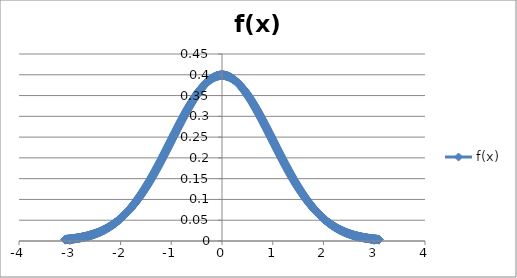
| Category | f(x) |
|---|---|
| -3.090232306167813 | 0.003 |
| -3.0840518415554774 | 0.003 |
| -3.0778713769431416 | 0.003 |
| -3.071690912330806 | 0.004 |
| -3.06551044771847 | 0.004 |
| -3.0593299831061342 | 0.004 |
| -3.0531495184937985 | 0.004 |
| -3.0469690538814627 | 0.004 |
| -3.040788589269127 | 0.004 |
| -3.034608124656791 | 0.004 |
| -3.0284276600444553 | 0.004 |
| -3.0222471954321195 | 0.004 |
| -3.0160667308197837 | 0.004 |
| -3.009886266207448 | 0.004 |
| -3.003705801595112 | 0.004 |
| -2.9975253369827763 | 0.004 |
| -2.9913448723704406 | 0.005 |
| -2.9851644077581048 | 0.005 |
| -2.978983943145769 | 0.005 |
| -2.972803478533433 | 0.005 |
| -2.9666230139210974 | 0.005 |
| -2.9604425493087616 | 0.005 |
| -2.954262084696426 | 0.005 |
| -2.94808162008409 | 0.005 |
| -2.9419011554717542 | 0.005 |
| -2.9357206908594184 | 0.005 |
| -2.9295402262470827 | 0.005 |
| -2.923359761634747 | 0.006 |
| -2.917179297022411 | 0.006 |
| -2.9109988324100753 | 0.006 |
| -2.9048183677977395 | 0.006 |
| -2.8986379031854037 | 0.006 |
| -2.892457438573068 | 0.006 |
| -2.886276973960732 | 0.006 |
| -2.8800965093483963 | 0.006 |
| -2.8739160447360605 | 0.006 |
| -2.8677355801237248 | 0.007 |
| -2.861555115511389 | 0.007 |
| -2.855374650899053 | 0.007 |
| -2.8491941862867174 | 0.007 |
| -2.8430137216743816 | 0.007 |
| -2.836833257062046 | 0.007 |
| -2.83065279244971 | 0.007 |
| -2.8244723278373742 | 0.007 |
| -2.8182918632250384 | 0.008 |
| -2.8121113986127027 | 0.008 |
| -2.805930934000367 | 0.008 |
| -2.799750469388031 | 0.008 |
| -2.7935700047756953 | 0.008 |
| -2.7873895401633595 | 0.008 |
| -2.7812090755510237 | 0.008 |
| -2.775028610938688 | 0.008 |
| -2.768848146326352 | 0.009 |
| -2.7626676817140163 | 0.009 |
| -2.7564872171016805 | 0.009 |
| -2.7503067524893448 | 0.009 |
| -2.744126287877009 | 0.009 |
| -2.737945823264673 | 0.009 |
| -2.7317653586523374 | 0.01 |
| -2.7255848940400016 | 0.01 |
| -2.719404429427666 | 0.01 |
| -2.71322396481533 | 0.01 |
| -2.7070435002029942 | 0.01 |
| -2.7008630355906584 | 0.01 |
| -2.6946825709783226 | 0.011 |
| -2.688502106365987 | 0.011 |
| -2.682321641753651 | 0.011 |
| -2.6761411771413153 | 0.011 |
| -2.6699607125289795 | 0.011 |
| -2.6637802479166437 | 0.011 |
| -2.657599783304308 | 0.012 |
| -2.651419318691972 | 0.012 |
| -2.6452388540796363 | 0.012 |
| -2.6390583894673005 | 0.012 |
| -2.6328779248549647 | 0.012 |
| -2.626697460242629 | 0.013 |
| -2.620516995630293 | 0.013 |
| -2.6143365310179574 | 0.013 |
| -2.6081560664056216 | 0.013 |
| -2.601975601793286 | 0.014 |
| -2.59579513718095 | 0.014 |
| -2.589614672568614 | 0.014 |
| -2.5834342079562784 | 0.014 |
| -2.5772537433439426 | 0.014 |
| -2.571073278731607 | 0.015 |
| -2.564892814119271 | 0.015 |
| -2.5587123495069353 | 0.015 |
| -2.5525318848945995 | 0.015 |
| -2.5463514202822637 | 0.016 |
| -2.540170955669928 | 0.016 |
| -2.533990491057592 | 0.016 |
| -2.5278100264452563 | 0.016 |
| -2.5216295618329205 | 0.017 |
| -2.5154490972205847 | 0.017 |
| -2.509268632608249 | 0.017 |
| -2.503088167995913 | 0.017 |
| -2.4969077033835774 | 0.018 |
| -2.4907272387712416 | 0.018 |
| -2.484546774158906 | 0.018 |
| -2.47836630954657 | 0.018 |
| -2.472185844934234 | 0.019 |
| -2.4660053803218984 | 0.019 |
| -2.4598249157095626 | 0.019 |
| -2.453644451097227 | 0.02 |
| -2.447463986484891 | 0.02 |
| -2.4412835218725553 | 0.02 |
| -2.4351030572602195 | 0.021 |
| -2.4289225926478837 | 0.021 |
| -2.422742128035548 | 0.021 |
| -2.416561663423212 | 0.022 |
| -2.4103811988108763 | 0.022 |
| -2.4042007341985405 | 0.022 |
| -2.3980202695862047 | 0.023 |
| -2.391839804973869 | 0.023 |
| -2.385659340361533 | 0.023 |
| -2.3794788757491974 | 0.024 |
| -2.3732984111368616 | 0.024 |
| -2.367117946524526 | 0.024 |
| -2.36093748191219 | 0.025 |
| -2.354757017299854 | 0.025 |
| -2.3485765526875184 | 0.025 |
| -2.3423960880751826 | 0.026 |
| -2.336215623462847 | 0.026 |
| -2.330035158850511 | 0.026 |
| -2.3238546942381753 | 0.027 |
| -2.3176742296258395 | 0.027 |
| -2.3114937650135037 | 0.028 |
| -2.305313300401168 | 0.028 |
| -2.299132835788832 | 0.028 |
| -2.2929523711764963 | 0.029 |
| -2.2867719065641605 | 0.029 |
| -2.2805914419518247 | 0.03 |
| -2.274410977339489 | 0.03 |
| -2.268230512727153 | 0.03 |
| -2.2620500481148174 | 0.031 |
| -2.2558695835024816 | 0.031 |
| -2.249689118890146 | 0.032 |
| -2.24350865427781 | 0.032 |
| -2.237328189665474 | 0.033 |
| -2.2311477250531384 | 0.033 |
| -2.2249672604408026 | 0.034 |
| -2.218786795828467 | 0.034 |
| -2.212606331216131 | 0.035 |
| -2.2064258666037952 | 0.035 |
| -2.2002454019914595 | 0.035 |
| -2.1940649373791237 | 0.036 |
| -2.187884472766788 | 0.036 |
| -2.181704008154452 | 0.037 |
| -2.1755235435421163 | 0.037 |
| -2.1693430789297805 | 0.038 |
| -2.1631626143174447 | 0.038 |
| -2.156982149705109 | 0.039 |
| -2.150801685092773 | 0.039 |
| -2.1446212204804374 | 0.04 |
| -2.1384407558681016 | 0.041 |
| -2.1322602912557658 | 0.041 |
| -2.12607982664343 | 0.042 |
| -2.119899362031094 | 0.042 |
| -2.1137188974187584 | 0.043 |
| -2.1075384328064226 | 0.043 |
| -2.101357968194087 | 0.044 |
| -2.095177503581751 | 0.044 |
| -2.0889970389694152 | 0.045 |
| -2.0828165743570795 | 0.046 |
| -2.0766361097447437 | 0.046 |
| -2.070455645132408 | 0.047 |
| -2.064275180520072 | 0.047 |
| -2.0580947159077363 | 0.048 |
| -2.0519142512954005 | 0.049 |
| -2.0457337866830647 | 0.049 |
| -2.039553322070729 | 0.05 |
| -2.033372857458393 | 0.05 |
| -2.0271923928460573 | 0.051 |
| -2.0210119282337216 | 0.052 |
| -2.0148314636213858 | 0.052 |
| -2.00865099900905 | 0.053 |
| -2.002470534396714 | 0.054 |
| -1.9962900697843786 | 0.054 |
| -1.990109605172043 | 0.055 |
| -1.9839291405597075 | 0.056 |
| -1.977748675947372 | 0.056 |
| -1.9715682113350363 | 0.057 |
| -1.9653877467227008 | 0.058 |
| -1.9592072821103652 | 0.059 |
| -1.9530268174980296 | 0.059 |
| -1.946846352885694 | 0.06 |
| -1.9406658882733585 | 0.061 |
| -1.934485423661023 | 0.061 |
| -1.9283049590486874 | 0.062 |
| -1.9221244944363518 | 0.063 |
| -1.9159440298240162 | 0.064 |
| -1.9097635652116807 | 0.064 |
| -1.903583100599345 | 0.065 |
| -1.8974026359870095 | 0.066 |
| -1.891222171374674 | 0.067 |
| -1.8850417067623384 | 0.067 |
| -1.8788612421500028 | 0.068 |
| -1.8726807775376673 | 0.069 |
| -1.8665003129253317 | 0.07 |
| -1.8603198483129961 | 0.071 |
| -1.8541393837006606 | 0.072 |
| -1.847958919088325 | 0.072 |
| -1.8417784544759894 | 0.073 |
| -1.8355979898636539 | 0.074 |
| -1.8294175252513183 | 0.075 |
| -1.8232370606389827 | 0.076 |
| -1.8170565960266472 | 0.077 |
| -1.8108761314143116 | 0.077 |
| -1.804695666801976 | 0.078 |
| -1.7985152021896404 | 0.079 |
| -1.7923347375773049 | 0.08 |
| -1.7861542729649693 | 0.081 |
| -1.7799738083526337 | 0.082 |
| -1.7737933437402982 | 0.083 |
| -1.7676128791279626 | 0.084 |
| -1.761432414515627 | 0.085 |
| -1.7552519499032915 | 0.085 |
| -1.749071485290956 | 0.086 |
| -1.7428910206786203 | 0.087 |
| -1.7367105560662848 | 0.088 |
| -1.7305300914539492 | 0.089 |
| -1.7243496268416136 | 0.09 |
| -1.718169162229278 | 0.091 |
| -1.7119886976169425 | 0.092 |
| -1.705808233004607 | 0.093 |
| -1.6996277683922714 | 0.094 |
| -1.6934473037799358 | 0.095 |
| -1.6872668391676002 | 0.096 |
| -1.6810863745552647 | 0.097 |
| -1.674905909942929 | 0.098 |
| -1.6687254453305935 | 0.099 |
| -1.662544980718258 | 0.1 |
| -1.6563645161059224 | 0.101 |
| -1.6501840514935868 | 0.102 |
| -1.6440035868812513 | 0.103 |
| -1.6378231222689157 | 0.104 |
| -1.6316426576565801 | 0.105 |
| -1.6254621930442446 | 0.106 |
| -1.619281728431909 | 0.108 |
| -1.6131012638195734 | 0.109 |
| -1.6069207992072378 | 0.11 |
| -1.6007403345949023 | 0.111 |
| -1.5945598699825667 | 0.112 |
| -1.5883794053702311 | 0.113 |
| -1.5821989407578956 | 0.114 |
| -1.57601847614556 | 0.115 |
| -1.5698380115332244 | 0.116 |
| -1.5636575469208889 | 0.117 |
| -1.5574770823085533 | 0.119 |
| -1.5512966176962177 | 0.12 |
| -1.5451161530838822 | 0.121 |
| -1.5389356884715466 | 0.122 |
| -1.532755223859211 | 0.123 |
| -1.5265747592468755 | 0.124 |
| -1.52039429463454 | 0.126 |
| -1.5142138300222043 | 0.127 |
| -1.5080333654098688 | 0.128 |
| -1.5018529007975332 | 0.129 |
| -1.4956724361851976 | 0.13 |
| -1.489491971572862 | 0.132 |
| -1.4833115069605265 | 0.133 |
| -1.477131042348191 | 0.134 |
| -1.4709505777358554 | 0.135 |
| -1.4647701131235198 | 0.136 |
| -1.4585896485111842 | 0.138 |
| -1.4524091838988487 | 0.139 |
| -1.446228719286513 | 0.14 |
| -1.4400482546741775 | 0.141 |
| -1.433867790061842 | 0.143 |
| -1.4276873254495064 | 0.144 |
| -1.4215068608371708 | 0.145 |
| -1.4153263962248352 | 0.147 |
| -1.4091459316124997 | 0.148 |
| -1.4029654670001641 | 0.149 |
| -1.3967850023878285 | 0.15 |
| -1.390604537775493 | 0.152 |
| -1.3844240731631574 | 0.153 |
| -1.3782436085508218 | 0.154 |
| -1.3720631439384863 | 0.156 |
| -1.3658826793261507 | 0.157 |
| -1.3597022147138151 | 0.158 |
| -1.3535217501014796 | 0.16 |
| -1.347341285489144 | 0.161 |
| -1.3411608208768084 | 0.162 |
| -1.3349803562644729 | 0.164 |
| -1.3287998916521373 | 0.165 |
| -1.3226194270398017 | 0.166 |
| -1.3164389624274662 | 0.168 |
| -1.3102584978151306 | 0.169 |
| -1.304078033202795 | 0.17 |
| -1.2978975685904595 | 0.172 |
| -1.291717103978124 | 0.173 |
| -1.2855366393657883 | 0.175 |
| -1.2793561747534528 | 0.176 |
| -1.2731757101411172 | 0.177 |
| -1.2669952455287816 | 0.179 |
| -1.260814780916446 | 0.18 |
| -1.2546343163041105 | 0.182 |
| -1.248453851691775 | 0.183 |
| -1.2422733870794394 | 0.184 |
| -1.2360929224671038 | 0.186 |
| -1.2299124578547682 | 0.187 |
| -1.2237319932424326 | 0.189 |
| -1.217551528630097 | 0.19 |
| -1.2113710640177615 | 0.192 |
| -1.205190599405426 | 0.193 |
| -1.1990101347930904 | 0.194 |
| -1.1928296701807548 | 0.196 |
| -1.1866492055684192 | 0.197 |
| -1.1804687409560837 | 0.199 |
| -1.174288276343748 | 0.2 |
| -1.1681078117314125 | 0.202 |
| -1.161927347119077 | 0.203 |
| -1.1557468825067414 | 0.205 |
| -1.1495664178944058 | 0.206 |
| -1.1433859532820703 | 0.208 |
| -1.1372054886697347 | 0.209 |
| -1.1310250240573991 | 0.21 |
| -1.1248445594450636 | 0.212 |
| -1.118664094832728 | 0.213 |
| -1.1124836302203924 | 0.215 |
| -1.1063031656080569 | 0.216 |
| -1.1001227009957213 | 0.218 |
| -1.0939422363833857 | 0.219 |
| -1.0877617717710502 | 0.221 |
| -1.0815813071587146 | 0.222 |
| -1.075400842546379 | 0.224 |
| -1.0692203779340435 | 0.225 |
| -1.0630399133217079 | 0.227 |
| -1.0568594487093723 | 0.228 |
| -1.0506789840970368 | 0.23 |
| -1.0444985194847012 | 0.231 |
| -1.0383180548723656 | 0.233 |
| -1.03213759026003 | 0.234 |
| -1.0259571256476945 | 0.236 |
| -1.019776661035359 | 0.237 |
| -1.0135961964230233 | 0.239 |
| -1.0074157318106878 | 0.24 |
| -1.0012352671983522 | 0.242 |
| -0.9950548025860165 | 0.243 |
| -0.9888743379736809 | 0.245 |
| -0.9826938733613452 | 0.246 |
| -0.9765134087490095 | 0.248 |
| -0.9703329441366738 | 0.249 |
| -0.9641524795243381 | 0.251 |
| -0.9579720149120025 | 0.252 |
| -0.9517915502996668 | 0.254 |
| -0.9456110856873311 | 0.255 |
| -0.9394306210749954 | 0.257 |
| -0.9332501564626597 | 0.258 |
| -0.9270696918503241 | 0.26 |
| -0.9208892272379884 | 0.261 |
| -0.9147087626256527 | 0.263 |
| -0.908528298013317 | 0.264 |
| -0.9023478334009813 | 0.266 |
| -0.8961673687886457 | 0.267 |
| -0.88998690417631 | 0.268 |
| -0.8838064395639743 | 0.27 |
| -0.8776259749516386 | 0.271 |
| -0.871445510339303 | 0.273 |
| -0.8652650457269673 | 0.274 |
| -0.8590845811146316 | 0.276 |
| -0.8529041165022959 | 0.277 |
| -0.8467236518899602 | 0.279 |
| -0.8405431872776246 | 0.28 |
| -0.8343627226652889 | 0.282 |
| -0.8281822580529532 | 0.283 |
| -0.8220017934406175 | 0.285 |
| -0.8158213288282818 | 0.286 |
| -0.8096408642159462 | 0.287 |
| -0.8034603996036105 | 0.289 |
| -0.7972799349912748 | 0.29 |
| -0.7910994703789391 | 0.292 |
| -0.7849190057666035 | 0.293 |
| -0.7787385411542678 | 0.295 |
| -0.7725580765419321 | 0.296 |
| -0.7663776119295964 | 0.297 |
| -0.7601971473172607 | 0.299 |
| -0.7540166827049251 | 0.3 |
| -0.7478362180925894 | 0.302 |
| -0.7416557534802537 | 0.303 |
| -0.735475288867918 | 0.304 |
| -0.7292948242555823 | 0.306 |
| -0.7231143596432467 | 0.307 |
| -0.716933895030911 | 0.309 |
| -0.7107534304185753 | 0.31 |
| -0.7045729658062396 | 0.311 |
| -0.698392501193904 | 0.313 |
| -0.6922120365815683 | 0.314 |
| -0.6860315719692326 | 0.315 |
| -0.6798511073568969 | 0.317 |
| -0.6736706427445612 | 0.318 |
| -0.6674901781322256 | 0.319 |
| -0.6613097135198899 | 0.321 |
| -0.6551292489075542 | 0.322 |
| -0.6489487842952185 | 0.323 |
| -0.6427683196828828 | 0.324 |
| -0.6365878550705472 | 0.326 |
| -0.6304073904582115 | 0.327 |
| -0.6242269258458758 | 0.328 |
| -0.6180464612335401 | 0.33 |
| -0.6118659966212044 | 0.331 |
| -0.6056855320088688 | 0.332 |
| -0.5995050673965331 | 0.333 |
| -0.5933246027841974 | 0.335 |
| -0.5871441381718617 | 0.336 |
| -0.580963673559526 | 0.337 |
| -0.5747832089471904 | 0.338 |
| -0.5686027443348547 | 0.339 |
| -0.562422279722519 | 0.341 |
| -0.5562418151101833 | 0.342 |
| -0.5500613504978477 | 0.343 |
| -0.543880885885512 | 0.344 |
| -0.5377004212731763 | 0.345 |
| -0.5315199566608406 | 0.346 |
| -0.5253394920485049 | 0.348 |
| -0.5191590274361693 | 0.349 |
| -0.5129785628238336 | 0.35 |
| -0.5067980982114979 | 0.351 |
| -0.5006176335991622 | 0.352 |
| -0.4944371689868266 | 0.353 |
| -0.488256704374491 | 0.354 |
| -0.48207623976215536 | 0.355 |
| -0.47589577514981973 | 0.356 |
| -0.4697153105374841 | 0.357 |
| -0.4635348459251485 | 0.358 |
| -0.45735438131281286 | 0.359 |
| -0.45117391670047724 | 0.36 |
| -0.4449934520881416 | 0.361 |
| -0.438812987475806 | 0.362 |
| -0.43263252286347037 | 0.363 |
| -0.42645205825113475 | 0.364 |
| -0.4202715936387991 | 0.365 |
| -0.4140911290264635 | 0.366 |
| -0.4079106644141279 | 0.367 |
| -0.40173019980179225 | 0.368 |
| -0.39554973518945663 | 0.369 |
| -0.389369270577121 | 0.37 |
| -0.3831888059647854 | 0.371 |
| -0.37700834135244976 | 0.372 |
| -0.37082787674011414 | 0.372 |
| -0.3646474121277785 | 0.373 |
| -0.3584669475154429 | 0.374 |
| -0.35228648290310727 | 0.375 |
| -0.34610601829077164 | 0.376 |
| -0.339925553678436 | 0.377 |
| -0.3337450890661004 | 0.377 |
| -0.3275646244537648 | 0.378 |
| -0.32138415984142915 | 0.379 |
| -0.31520369522909353 | 0.38 |
| -0.3090232306167579 | 0.38 |
| -0.3028427660044223 | 0.381 |
| -0.29666230139208666 | 0.382 |
| -0.29048183677975103 | 0.382 |
| -0.2843013721674154 | 0.383 |
| -0.2781209075550798 | 0.384 |
| -0.27194044294274416 | 0.384 |
| -0.26575997833040854 | 0.385 |
| -0.2595795137180729 | 0.386 |
| -0.2533990491057373 | 0.386 |
| -0.24721858449340167 | 0.387 |
| -0.24103811988106605 | 0.388 |
| -0.23485765526873043 | 0.388 |
| -0.2286771906563948 | 0.389 |
| -0.22249672604405918 | 0.389 |
| -0.21631626143172356 | 0.39 |
| -0.21013579681938793 | 0.39 |
| -0.2039553322070523 | 0.391 |
| -0.19777486759471669 | 0.391 |
| -0.19159440298238106 | 0.392 |
| -0.18541393837004544 | 0.392 |
| -0.17923347375770982 | 0.393 |
| -0.1730530091453742 | 0.393 |
| -0.16687254453303857 | 0.393 |
| -0.16069207992070295 | 0.394 |
| -0.15451161530836732 | 0.394 |
| -0.1483311506960317 | 0.395 |
| -0.14215068608369608 | 0.395 |
| -0.13597022147136045 | 0.395 |
| -0.12978975685902483 | 0.396 |
| -0.1236092922466892 | 0.396 |
| -0.11742882763435358 | 0.396 |
| -0.11124836302201796 | 0.396 |
| -0.10506789840968234 | 0.397 |
| -0.09888743379734671 | 0.397 |
| -0.09270696918501109 | 0.397 |
| -0.08652650457267547 | 0.397 |
| -0.08034603996033984 | 0.398 |
| -0.07416557534800422 | 0.398 |
| -0.0679851107356686 | 0.398 |
| -0.061804646123332974 | 0.398 |
| -0.05562418151099735 | 0.398 |
| -0.04944371689866173 | 0.398 |
| -0.043263252286326104 | 0.399 |
| -0.03708278767399048 | 0.399 |
| -0.030902323061654854 | 0.399 |
| -0.024721858449319227 | 0.399 |
| -0.0185413938369836 | 0.399 |
| -0.012360929224647974 | 0.399 |
| -0.006180464612312347 | 0.399 |
| 2.327998904760875e-14 | 0.399 |
| 0.006180464612358907 | 0.399 |
| 0.012360929224694533 | 0.399 |
| 0.01854139383703016 | 0.399 |
| 0.024721858449365787 | 0.399 |
| 0.030902323061701414 | 0.399 |
| 0.03708278767403704 | 0.399 |
| 0.043263252286372664 | 0.399 |
| 0.04944371689870829 | 0.398 |
| 0.05562418151104391 | 0.398 |
| 0.061804646123379534 | 0.398 |
| 0.06798511073571516 | 0.398 |
| 0.07416557534805078 | 0.398 |
| 0.0803460399603864 | 0.398 |
| 0.08652650457272203 | 0.397 |
| 0.09270696918505765 | 0.397 |
| 0.09888743379739327 | 0.397 |
| 0.1050678984097289 | 0.397 |
| 0.11124836302206452 | 0.396 |
| 0.11742882763440014 | 0.396 |
| 0.12360929224673577 | 0.396 |
| 0.1297897568590714 | 0.396 |
| 0.13597022147140703 | 0.395 |
| 0.14215068608374265 | 0.395 |
| 0.14833115069607827 | 0.395 |
| 0.1545116153084139 | 0.394 |
| 0.16069207992074952 | 0.394 |
| 0.16687254453308514 | 0.393 |
| 0.17305300914542077 | 0.393 |
| 0.1792334737577564 | 0.393 |
| 0.185413938370092 | 0.392 |
| 0.19159440298242764 | 0.392 |
| 0.19777486759476326 | 0.391 |
| 0.20395533220709888 | 0.391 |
| 0.2101357968194345 | 0.39 |
| 0.21631626143177013 | 0.39 |
| 0.22249672604410575 | 0.389 |
| 0.22867719065644138 | 0.389 |
| 0.234857655268777 | 0.388 |
| 0.24103811988111262 | 0.388 |
| 0.24721858449344825 | 0.387 |
| 0.25339904910578387 | 0.386 |
| 0.2595795137181195 | 0.386 |
| 0.2657599783304551 | 0.385 |
| 0.27194044294279074 | 0.384 |
| 0.27812090755512636 | 0.384 |
| 0.284301372167462 | 0.383 |
| 0.2904818367797976 | 0.382 |
| 0.29666230139213323 | 0.382 |
| 0.30284276600446886 | 0.381 |
| 0.3090232306168045 | 0.38 |
| 0.3152036952291401 | 0.38 |
| 0.3213841598414757 | 0.379 |
| 0.32756462445381135 | 0.378 |
| 0.33374508906614697 | 0.377 |
| 0.3399255536784826 | 0.377 |
| 0.3461060182908182 | 0.376 |
| 0.35228648290315384 | 0.375 |
| 0.35846694751548946 | 0.374 |
| 0.3646474121278251 | 0.373 |
| 0.3708278767401607 | 0.372 |
| 0.37700834135249633 | 0.372 |
| 0.38318880596483196 | 0.371 |
| 0.3893692705771676 | 0.37 |
| 0.3955497351895032 | 0.369 |
| 0.4017301998018388 | 0.368 |
| 0.40791066441417445 | 0.367 |
| 0.4140911290265101 | 0.366 |
| 0.4202715936388457 | 0.365 |
| 0.4264520582511813 | 0.364 |
| 0.43263252286351694 | 0.363 |
| 0.43881298747585257 | 0.362 |
| 0.4449934520881882 | 0.361 |
| 0.4511739167005238 | 0.36 |
| 0.45735438131285944 | 0.359 |
| 0.46353484592519506 | 0.358 |
| 0.4697153105375307 | 0.357 |
| 0.4758957751498663 | 0.356 |
| 0.48207623976220193 | 0.355 |
| 0.48825670437453755 | 0.354 |
| 0.4944371689868732 | 0.353 |
| 0.5006176335992089 | 0.352 |
| 0.5067980982115445 | 0.351 |
| 0.5129785628238802 | 0.35 |
| 0.5191590274362159 | 0.349 |
| 0.5253394920485516 | 0.348 |
| 0.5315199566608872 | 0.346 |
| 0.5377004212732229 | 0.345 |
| 0.5438808858855586 | 0.344 |
| 0.5500613504978943 | 0.343 |
| 0.55624181511023 | 0.342 |
| 0.5624222797225656 | 0.341 |
| 0.5686027443349013 | 0.339 |
| 0.574783208947237 | 0.338 |
| 0.5809636735595727 | 0.337 |
| 0.5871441381719084 | 0.336 |
| 0.593324602784244 | 0.335 |
| 0.5995050673965797 | 0.333 |
| 0.6056855320089154 | 0.332 |
| 0.6118659966212511 | 0.331 |
| 0.6180464612335868 | 0.33 |
| 0.6242269258459224 | 0.328 |
| 0.6304073904582581 | 0.327 |
| 0.6365878550705938 | 0.326 |
| 0.6427683196829295 | 0.324 |
| 0.6489487842952651 | 0.323 |
| 0.6551292489076008 | 0.322 |
| 0.6613097135199365 | 0.321 |
| 0.6674901781322722 | 0.319 |
| 0.6736706427446079 | 0.318 |
| 0.6798511073569435 | 0.317 |
| 0.6860315719692792 | 0.315 |
| 0.6922120365816149 | 0.314 |
| 0.6983925011939506 | 0.313 |
| 0.7045729658062863 | 0.311 |
| 0.7107534304186219 | 0.31 |
| 0.7169338950309576 | 0.309 |
| 0.7231143596432933 | 0.307 |
| 0.729294824255629 | 0.306 |
| 0.7354752888679646 | 0.304 |
| 0.7416557534803003 | 0.303 |
| 0.747836218092636 | 0.302 |
| 0.7540166827049717 | 0.3 |
| 0.7601971473173074 | 0.299 |
| 0.766377611929643 | 0.297 |
| 0.7725580765419787 | 0.296 |
| 0.7787385411543144 | 0.295 |
| 0.7849190057666501 | 0.293 |
| 0.7910994703789858 | 0.292 |
| 0.7972799349913214 | 0.29 |
| 0.8034603996036571 | 0.289 |
| 0.8096408642159928 | 0.287 |
| 0.8158213288283285 | 0.286 |
| 0.8220017934406642 | 0.285 |
| 0.8281822580529998 | 0.283 |
| 0.8343627226653355 | 0.282 |
| 0.8405431872776712 | 0.28 |
| 0.8467236518900069 | 0.279 |
| 0.8529041165023425 | 0.277 |
| 0.8590845811146782 | 0.276 |
| 0.8652650457270139 | 0.274 |
| 0.8714455103393496 | 0.273 |
| 0.8776259749516853 | 0.271 |
| 0.8838064395640209 | 0.27 |
| 0.8899869041763566 | 0.268 |
| 0.8961673687886923 | 0.267 |
| 0.902347833401028 | 0.266 |
| 0.9085282980133637 | 0.264 |
| 0.9147087626256993 | 0.263 |
| 0.920889227238035 | 0.261 |
| 0.9270696918503707 | 0.26 |
| 0.9332501564627064 | 0.258 |
| 0.939430621075042 | 0.257 |
| 0.9456110856873777 | 0.255 |
| 0.9517915502997134 | 0.254 |
| 0.9579720149120491 | 0.252 |
| 0.9641524795243848 | 0.251 |
| 0.9703329441367204 | 0.249 |
| 0.9765134087490561 | 0.248 |
| 0.9826938733613918 | 0.246 |
| 0.9888743379737275 | 0.245 |
| 0.9950548025860632 | 0.243 |
| 1.0012352671983988 | 0.242 |
| 1.0074157318107344 | 0.24 |
| 1.01359619642307 | 0.239 |
| 1.0197766610354055 | 0.237 |
| 1.025957125647741 | 0.236 |
| 1.0321375902600767 | 0.234 |
| 1.0383180548724122 | 0.233 |
| 1.0444985194847478 | 0.231 |
| 1.0506789840970834 | 0.23 |
| 1.056859448709419 | 0.228 |
| 1.0630399133217545 | 0.227 |
| 1.06922037793409 | 0.225 |
| 1.0754008425464257 | 0.224 |
| 1.0815813071587612 | 0.222 |
| 1.0877617717710968 | 0.221 |
| 1.0939422363834324 | 0.219 |
| 1.100122700995768 | 0.218 |
| 1.1063031656081035 | 0.216 |
| 1.112483630220439 | 0.215 |
| 1.1186640948327746 | 0.213 |
| 1.1248445594451102 | 0.212 |
| 1.1310250240574458 | 0.21 |
| 1.1372054886697813 | 0.209 |
| 1.143385953282117 | 0.208 |
| 1.1495664178944525 | 0.206 |
| 1.155746882506788 | 0.205 |
| 1.1619273471191236 | 0.203 |
| 1.1681078117314592 | 0.202 |
| 1.1742882763437947 | 0.2 |
| 1.1804687409561303 | 0.199 |
| 1.1866492055684659 | 0.197 |
| 1.1928296701808014 | 0.196 |
| 1.199010134793137 | 0.194 |
| 1.2051905994054726 | 0.193 |
| 1.2113710640178081 | 0.192 |
| 1.2175515286301437 | 0.19 |
| 1.2237319932424793 | 0.189 |
| 1.2299124578548148 | 0.187 |
| 1.2360929224671504 | 0.186 |
| 1.242273387079486 | 0.184 |
| 1.2484538516918215 | 0.183 |
| 1.2546343163041571 | 0.182 |
| 1.2608147809164927 | 0.18 |
| 1.2669952455288283 | 0.179 |
| 1.2731757101411638 | 0.177 |
| 1.2793561747534994 | 0.176 |
| 1.285536639365835 | 0.175 |
| 1.2917171039781705 | 0.173 |
| 1.297897568590506 | 0.172 |
| 1.3040780332028417 | 0.17 |
| 1.3102584978151772 | 0.169 |
| 1.3164389624275128 | 0.168 |
| 1.3226194270398484 | 0.166 |
| 1.328799891652184 | 0.165 |
| 1.3349803562645195 | 0.164 |
| 1.341160820876855 | 0.162 |
| 1.3473412854891906 | 0.161 |
| 1.3535217501015262 | 0.16 |
| 1.3597022147138618 | 0.158 |
| 1.3658826793261973 | 0.157 |
| 1.372063143938533 | 0.156 |
| 1.3782436085508685 | 0.154 |
| 1.384424073163204 | 0.153 |
| 1.3906045377755396 | 0.152 |
| 1.3967850023878752 | 0.15 |
| 1.4029654670002107 | 0.149 |
| 1.4091459316125463 | 0.148 |
| 1.4153263962248819 | 0.147 |
| 1.4215068608372174 | 0.145 |
| 1.427687325449553 | 0.144 |
| 1.4338677900618886 | 0.143 |
| 1.4400482546742241 | 0.141 |
| 1.4462287192865597 | 0.14 |
| 1.4524091838988953 | 0.139 |
| 1.4585896485112309 | 0.138 |
| 1.4647701131235664 | 0.136 |
| 1.470950577735902 | 0.135 |
| 1.4771310423482376 | 0.134 |
| 1.4833115069605731 | 0.133 |
| 1.4894919715729087 | 0.132 |
| 1.4956724361852443 | 0.13 |
| 1.5018529007975798 | 0.129 |
| 1.5080333654099154 | 0.128 |
| 1.514213830022251 | 0.127 |
| 1.5203942946345865 | 0.126 |
| 1.526574759246922 | 0.124 |
| 1.5327552238592577 | 0.123 |
| 1.5389356884715932 | 0.122 |
| 1.5451161530839288 | 0.121 |
| 1.5512966176962644 | 0.12 |
| 1.5574770823086 | 0.119 |
| 1.5636575469209355 | 0.117 |
| 1.569838011533271 | 0.116 |
| 1.5760184761456066 | 0.115 |
| 1.5821989407579422 | 0.114 |
| 1.5883794053702778 | 0.113 |
| 1.5945598699826133 | 0.112 |
| 1.600740334594949 | 0.111 |
| 1.6069207992072845 | 0.11 |
| 1.61310126381962 | 0.109 |
| 1.6192817284319556 | 0.108 |
| 1.6254621930442912 | 0.106 |
| 1.6316426576566267 | 0.105 |
| 1.6378231222689623 | 0.104 |
| 1.6440035868812979 | 0.103 |
| 1.6501840514936335 | 0.102 |
| 1.656364516105969 | 0.101 |
| 1.6625449807183046 | 0.1 |
| 1.6687254453306402 | 0.099 |
| 1.6749059099429757 | 0.098 |
| 1.6810863745553113 | 0.097 |
| 1.6872668391676469 | 0.096 |
| 1.6934473037799824 | 0.095 |
| 1.699627768392318 | 0.094 |
| 1.7058082330046536 | 0.093 |
| 1.7119886976169891 | 0.092 |
| 1.7181691622293247 | 0.091 |
| 1.7243496268416603 | 0.09 |
| 1.7305300914539958 | 0.089 |
| 1.7367105560663314 | 0.088 |
| 1.742891020678667 | 0.087 |
| 1.7490714852910025 | 0.086 |
| 1.755251949903338 | 0.085 |
| 1.7614324145156737 | 0.085 |
| 1.7676128791280092 | 0.084 |
| 1.7737933437403448 | 0.083 |
| 1.7799738083526804 | 0.082 |
| 1.786154272965016 | 0.081 |
| 1.7923347375773515 | 0.08 |
| 1.798515202189687 | 0.079 |
| 1.8046956668020226 | 0.078 |
| 1.8108761314143582 | 0.077 |
| 1.8170565960266938 | 0.077 |
| 1.8232370606390293 | 0.076 |
| 1.829417525251365 | 0.075 |
| 1.8355979898637005 | 0.074 |
| 1.841778454476036 | 0.073 |
| 1.8479589190883716 | 0.072 |
| 1.8541393837007072 | 0.072 |
| 1.8603198483130428 | 0.071 |
| 1.8665003129253783 | 0.07 |
| 1.872680777537714 | 0.069 |
| 1.8788612421500495 | 0.068 |
| 1.885041706762385 | 0.067 |
| 1.8912221713747206 | 0.067 |
| 1.8974026359870562 | 0.066 |
| 1.9035831005993917 | 0.065 |
| 1.9097635652117273 | 0.064 |
| 1.9159440298240629 | 0.064 |
| 1.9221244944363984 | 0.063 |
| 1.928304959048734 | 0.062 |
| 1.9344854236610696 | 0.061 |
| 1.9406658882734051 | 0.061 |
| 1.9468463528857407 | 0.06 |
| 1.9530268174980763 | 0.059 |
| 1.9592072821104118 | 0.059 |
| 1.9653877467227474 | 0.058 |
| 1.971568211335083 | 0.057 |
| 1.9777486759474185 | 0.056 |
| 1.9839291405597541 | 0.056 |
| 1.9901096051720897 | 0.055 |
| 1.9962900697844252 | 0.054 |
| 2.002470534396761 | 0.054 |
| 2.0086509990090966 | 0.053 |
| 2.0148314636214324 | 0.052 |
| 2.021011928233768 | 0.052 |
| 2.027192392846104 | 0.051 |
| 2.0333728574584398 | 0.05 |
| 2.0395533220707756 | 0.05 |
| 2.0457337866831113 | 0.049 |
| 2.051914251295447 | 0.049 |
| 2.058094715907783 | 0.048 |
| 2.0642751805201187 | 0.047 |
| 2.0704556451324545 | 0.047 |
| 2.0766361097447903 | 0.046 |
| 2.082816574357126 | 0.046 |
| 2.088997038969462 | 0.045 |
| 2.0951775035817977 | 0.044 |
| 2.1013579681941335 | 0.044 |
| 2.1075384328064692 | 0.043 |
| 2.113718897418805 | 0.043 |
| 2.119899362031141 | 0.042 |
| 2.1260798266434766 | 0.042 |
| 2.1322602912558124 | 0.041 |
| 2.138440755868148 | 0.041 |
| 2.144621220480484 | 0.04 |
| 2.1508016850928198 | 0.039 |
| 2.1569821497051556 | 0.039 |
| 2.1631626143174914 | 0.038 |
| 2.169343078929827 | 0.038 |
| 2.175523543542163 | 0.037 |
| 2.1817040081544987 | 0.037 |
| 2.1878844727668345 | 0.036 |
| 2.1940649373791703 | 0.036 |
| 2.200245401991506 | 0.035 |
| 2.206425866603842 | 0.035 |
| 2.2126063312161777 | 0.035 |
| 2.2187867958285135 | 0.034 |
| 2.2249672604408492 | 0.034 |
| 2.231147725053185 | 0.033 |
| 2.237328189665521 | 0.033 |
| 2.2435086542778566 | 0.032 |
| 2.2496891188901924 | 0.032 |
| 2.255869583502528 | 0.031 |
| 2.262050048114864 | 0.031 |
| 2.2682305127271998 | 0.03 |
| 2.2744109773395356 | 0.03 |
| 2.2805914419518714 | 0.03 |
| 2.286771906564207 | 0.029 |
| 2.292952371176543 | 0.029 |
| 2.2991328357888787 | 0.028 |
| 2.3053133004012145 | 0.028 |
| 2.3114937650135503 | 0.028 |
| 2.317674229625886 | 0.027 |
| 2.323854694238222 | 0.027 |
| 2.3300351588505577 | 0.026 |
| 2.3362156234628935 | 0.026 |
| 2.3423960880752293 | 0.026 |
| 2.348576552687565 | 0.025 |
| 2.354757017299901 | 0.025 |
| 2.3609374819122366 | 0.025 |
| 2.3671179465245724 | 0.024 |
| 2.373298411136908 | 0.024 |
| 2.379478875749244 | 0.024 |
| 2.38565934036158 | 0.023 |
| 2.3918398049739156 | 0.023 |
| 2.3980202695862514 | 0.023 |
| 2.404200734198587 | 0.022 |
| 2.410381198810923 | 0.022 |
| 2.4165616634232587 | 0.022 |
| 2.4227421280355945 | 0.021 |
| 2.4289225926479303 | 0.021 |
| 2.435103057260266 | 0.021 |
| 2.441283521872602 | 0.02 |
| 2.4474639864849377 | 0.02 |
| 2.4536444510972735 | 0.02 |
| 2.4598249157096093 | 0.019 |
| 2.466005380321945 | 0.019 |
| 2.472185844934281 | 0.019 |
| 2.4783663095466166 | 0.018 |
| 2.4845467741589524 | 0.018 |
| 2.490727238771288 | 0.018 |
| 2.496907703383624 | 0.018 |
| 2.50308816799596 | 0.017 |
| 2.5092686326082956 | 0.017 |
| 2.5154490972206314 | 0.017 |
| 2.521629561832967 | 0.017 |
| 2.527810026445303 | 0.016 |
| 2.5339904910576387 | 0.016 |
| 2.5401709556699745 | 0.016 |
| 2.5463514202823103 | 0.016 |
| 2.552531884894646 | 0.015 |
| 2.558712349506982 | 0.015 |
| 2.5648928141193177 | 0.015 |
| 2.5710732787316535 | 0.015 |
| 2.5772537433439893 | 0.014 |
| 2.583434207956325 | 0.014 |
| 2.589614672568661 | 0.014 |
| 2.5957951371809966 | 0.014 |
| 2.6019756017933324 | 0.014 |
| 2.608156066405668 | 0.013 |
| 2.614336531018004 | 0.013 |
| 2.62051699563034 | 0.013 |
| 2.6266974602426756 | 0.013 |
| 2.6328779248550114 | 0.012 |
| 2.639058389467347 | 0.012 |
| 2.645238854079683 | 0.012 |
| 2.6514193186920187 | 0.012 |
| 2.6575997833043545 | 0.012 |
| 2.6637802479166903 | 0.011 |
| 2.669960712529026 | 0.011 |
| 2.676141177141362 | 0.011 |
| 2.6823216417536977 | 0.011 |
| 2.6885021063660335 | 0.011 |
| 2.6946825709783693 | 0.011 |
| 2.700863035590705 | 0.01 |
| 2.707043500203041 | 0.01 |
| 2.7132239648153766 | 0.01 |
| 2.7194044294277124 | 0.01 |
| 2.7255848940400482 | 0.01 |
| 2.731765358652384 | 0.01 |
| 2.73794582326472 | 0.009 |
| 2.7441262878770556 | 0.009 |
| 2.7503067524893914 | 0.009 |
| 2.756487217101727 | 0.009 |
| 2.762667681714063 | 0.009 |
| 2.7688481463263988 | 0.009 |
| 2.7750286109387345 | 0.008 |
| 2.7812090755510703 | 0.008 |
| 2.787389540163406 | 0.008 |
| 2.793570004775742 | 0.008 |
| 2.7997504693880777 | 0.008 |
| 2.8059309340004135 | 0.008 |
| 2.8121113986127493 | 0.008 |
| 2.818291863225085 | 0.008 |
| 2.824472327837421 | 0.007 |
| 2.8306527924497566 | 0.007 |
| 2.8368332570620924 | 0.007 |
| 2.8430137216744282 | 0.007 |
| 2.849194186286764 | 0.007 |
| 2.8553746508991 | 0.007 |
| 2.8615551155114356 | 0.007 |
| 2.8677355801237714 | 0.007 |
| 2.873916044736107 | 0.006 |
| 2.880096509348443 | 0.006 |
| 2.8862769739607788 | 0.006 |
| 2.8924574385731145 | 0.006 |
| 2.8986379031854503 | 0.006 |
| 2.904818367797786 | 0.006 |
| 2.910998832410122 | 0.006 |
| 2.9171792970224577 | 0.006 |
| 2.9233597616347935 | 0.006 |
| 2.9295402262471293 | 0.005 |
| 2.935720690859465 | 0.005 |
| 2.941901155471801 | 0.005 |
| 2.9480816200841367 | 0.005 |
| 2.9542620846964724 | 0.005 |
| 2.9604425493088082 | 0.005 |
| 2.966623013921144 | 0.005 |
| 2.97280347853348 | 0.005 |
| 2.9789839431458156 | 0.005 |
| 2.9851644077581514 | 0.005 |
| 2.991344872370487 | 0.005 |
| 2.997525336982823 | 0.004 |
| 3.0037058015951588 | 0.004 |
| 3.0098862662074946 | 0.004 |
| 3.0160667308198303 | 0.004 |
| 3.022247195432166 | 0.004 |
| 3.028427660044502 | 0.004 |
| 3.0346081246568377 | 0.004 |
| 3.0407885892691735 | 0.004 |
| 3.0469690538815093 | 0.004 |
| 3.053149518493845 | 0.004 |
| 3.059329983106181 | 0.004 |
| 3.0655104477185167 | 0.004 |
| 3.0716909123308525 | 0.004 |
| 3.0778713769431882 | 0.003 |
| 3.084051841555524 | 0.003 |
| 3.090232306167813 | 0.003 |